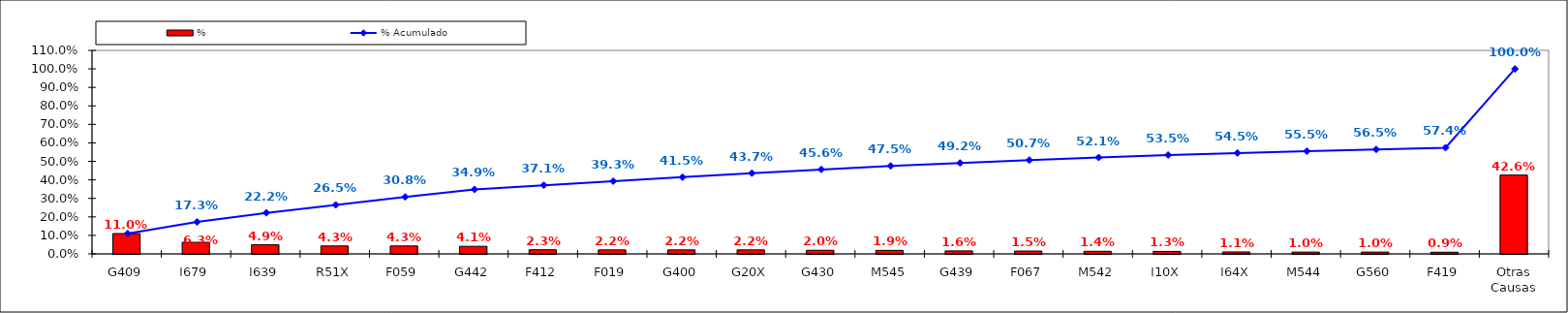
| Category | % |
|---|---|
| G409 | 0.11 |
| I679 | 0.063 |
| I639 | 0.049 |
| R51X | 0.043 |
| F059 | 0.043 |
| G442 | 0.041 |
| F412 | 0.023 |
| F019 | 0.022 |
| G400 | 0.022 |
| G20X | 0.022 |
| G430 | 0.02 |
| M545 | 0.019 |
| G439 | 0.016 |
| F067 | 0.015 |
| M542 | 0.014 |
| I10X | 0.013 |
| I64X | 0.011 |
| M544 | 0.01 |
| G560 | 0.01 |
| F419 | 0.009 |
| Otras Causas | 0.426 |